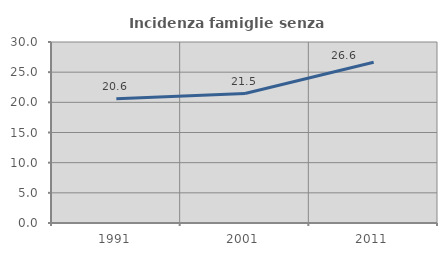
| Category | Incidenza famiglie senza nuclei |
|---|---|
| 1991.0 | 20.612 |
| 2001.0 | 21.453 |
| 2011.0 | 26.639 |